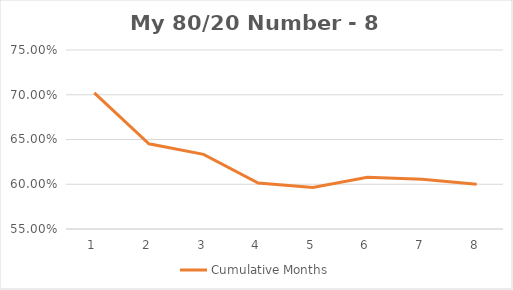
| Category | Cumulative Months |
|---|---|
| 0 | 0.702 |
| 1 | 0.645 |
| 2 | 0.633 |
| 3 | 0.601 |
| 4 | 0.596 |
| 5 | 0.608 |
| 6 | 0.606 |
| 7 | 0.6 |